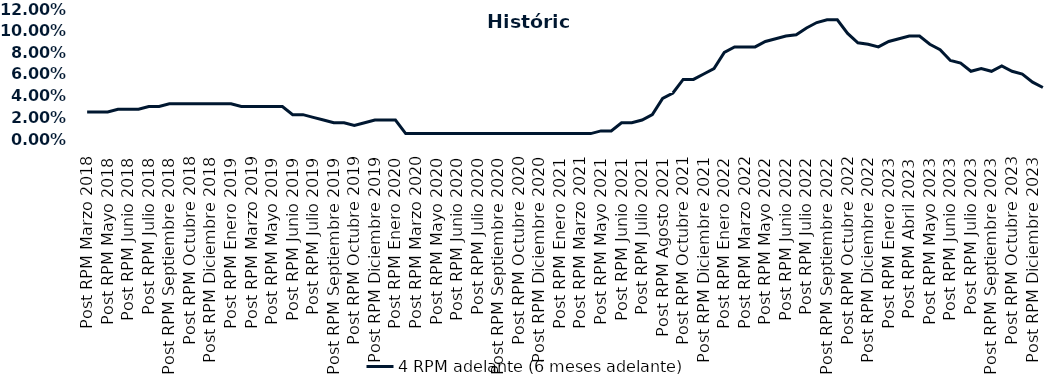
| Category | 4 RPM adelante (6 meses adelante) |
|---|---|
| Post RPM Marzo 2018 | 0.025 |
| Pre RPM Mayo 2018 | 0.025 |
| Post RPM Mayo 2018 | 0.025 |
| Pre RPM Junio 2018 | 0.028 |
| Post RPM Junio 2018 | 0.028 |
| Pre RPM Julio 2018 | 0.028 |
| Post RPM Julio 2018 | 0.03 |
| Pre RPM Septiembre 2018 | 0.03 |
| Post RPM Septiembre 2018 | 0.032 |
| Pre RPM Octubre 2018 | 0.032 |
| Post RPM Octubre 2018 | 0.032 |
| Pre RPM Diciembre 2018 | 0.032 |
| Post RPM Diciembre 2018 | 0.032 |
| Pre RPM Enero 2019 | 0.032 |
| Post RPM Enero 2019 | 0.032 |
| Pre RPM Marzo 2019 | 0.03 |
| Post RPM Marzo 2019 | 0.03 |
| Pre RPM Mayo 2019 | 0.03 |
| Post RPM Mayo 2019 | 0.03 |
| Pre RPM Junio 2019 | 0.03 |
| Post RPM Junio 2019 | 0.022 |
| Pre RPM Julio 2019 | 0.022 |
| Post RPM Julio 2019 | 0.02 |
| Pre RPM Septiembre 2019 | 0.018 |
| Post RPM Septiembre 2019 | 0.015 |
| Pre RPM Octubre 2019 | 0.015 |
| Post RPM Octubre 2019 | 0.012 |
| Pre RPM Diciembre 2019 | 0.015 |
| Post RPM Diciembre 2019 | 0.018 |
| Pre RPM Enero 2020 | 0.018 |
| Post RPM Enero 2020 | 0.018 |
| Pre RPM Marzo 2020 | 0.005 |
| Post RPM Marzo 2020 | 0.005 |
| Pre RPM Mayo 2020 | 0.005 |
| Post RPM Mayo 2020 | 0.005 |
| Pre RPM Junio 2020 | 0.005 |
| Post RPM Junio 2020 | 0.005 |
| Pre RPM Julio 2020 | 0.005 |
| Post RPM Julio 2020 | 0.005 |
| Pre RPM Septiembre 2020 | 0.005 |
| Post RPM Septiembre 2020 | 0.005 |
| Pre RPM Octubre 2020 | 0.005 |
| Post RPM Octubre 2020 | 0.005 |
| Pre RPM Diciembre 2020 | 0.005 |
| Post RPM Diciembre 2020 | 0.005 |
| Pre RPM Enero 2021 | 0.005 |
| Post RPM Enero 2021 | 0.005 |
| Pre RPM Marzo 2021 | 0.005 |
| Post RPM Marzo 2021 | 0.005 |
| Pre RPM Mayo 2021 | 0.005 |
| Post RPM Mayo 2021 | 0.008 |
| Pre RPM Junio 2021 | 0.008 |
| Post RPM Junio 2021 | 0.015 |
| Pre RPM Julio 2021 | 0.015 |
| Post RPM Julio 2021 | 0.018 |
| Pre RPM Agosto 2021 | 0.022 |
| Post RPM Agosto 2021 | 0.038 |
| Pre RPM Octubre 2021 | 0.042 |
| Post RPM Octubre 2021 | 0.055 |
| Pre RPM Diciembre 2021 | 0.055 |
| Post RPM Diciembre 2021 | 0.06 |
| Pre RPM Enero 2022 | 0.065 |
| Post RPM Enero 2022 | 0.08 |
| Pre RPM Marzo 2022 | 0.085 |
| Post RPM Marzo 2022 | 0.085 |
| Pre RPM Mayo 2022 | 0.085 |
| Post RPM Mayo 2022 | 0.09 |
| Pre RPM Junio 2022 | 0.092 |
| Post RPM Junio 2022 | 0.095 |
| Pre RPM Julio 2022 | 0.096 |
| Post RPM Julio 2022 | 0.102 |
| Pre RPM Septiembre 2022 | 0.108 |
| Post RPM Septiembre 2022 | 0.11 |
| Pre RPM Octubre 2022 | 0.11 |
| Post RPM Octubre 2022 | 0.098 |
| Pre RPM Diciembre 2022 | 0.089 |
| Post RPM Diciembre 2022 | 0.088 |
| Pre RPM Enero 2023 | 0.085 |
| Post RPM Enero 2023 | 0.09 |
| Pre RPM Abril 2023 | 0.092 |
| Post RPM Abril 2023 | 0.095 |
| Pre RPM Mayo 2023 | 0.095 |
| Post RPM Mayo 2023 | 0.088 |
| Pre RPM Junio 2023 | 0.082 |
| Post RPM Junio 2023 | 0.072 |
| Pre RPM Julio 2023 | 0.07 |
| Post RPM Julio 2023 | 0.062 |
| Pre RPM Septiembre 2023 | 0.065 |
| Post RPM Septiembre 2023 | 0.062 |
| Pre RPM Octubre 2023 | 0.068 |
| Post RPM Octubre 2023 | 0.062 |
| Pre RPM Diciembre 2023 | 0.06 |
| Post RPM Diciembre 2023 | 0.052 |
| Pre RPM Enero 2024 | 0.048 |